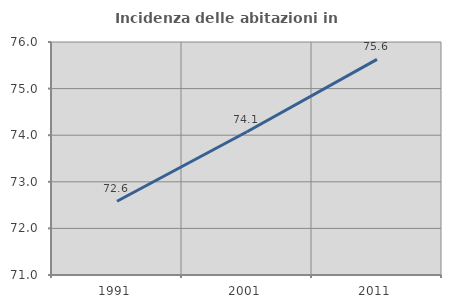
| Category | Incidenza delle abitazioni in proprietà  |
|---|---|
| 1991.0 | 72.583 |
| 2001.0 | 74.074 |
| 2011.0 | 75.628 |